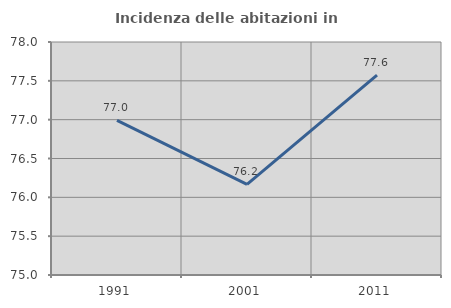
| Category | Incidenza delle abitazioni in proprietà  |
|---|---|
| 1991.0 | 76.99 |
| 2001.0 | 76.168 |
| 2011.0 | 77.574 |